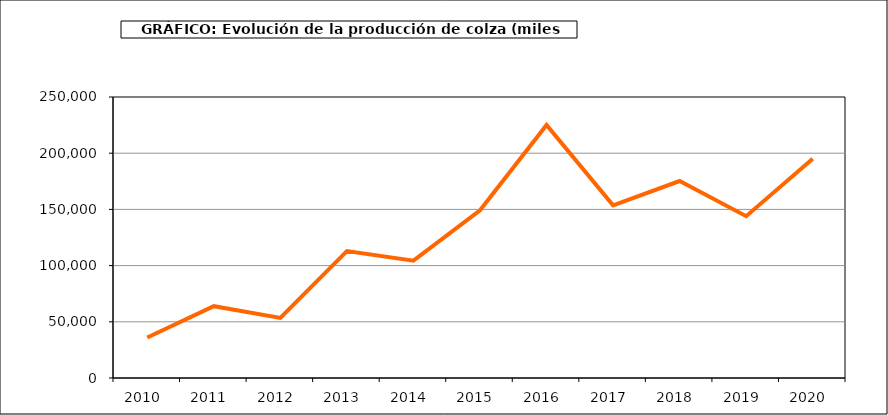
| Category | Producción |
|---|---|
| 2010.0 | 36029 |
| 2011.0 | 63902 |
| 2012.0 | 53447 |
| 2013.0 | 112928 |
| 2014.0 | 104361 |
| 2015.0 | 149198 |
| 2016.0 | 225165 |
| 2017.0 | 153665 |
| 2018.0 | 175231 |
| 2019.0 | 143981 |
| 2020.0 | 194998 |